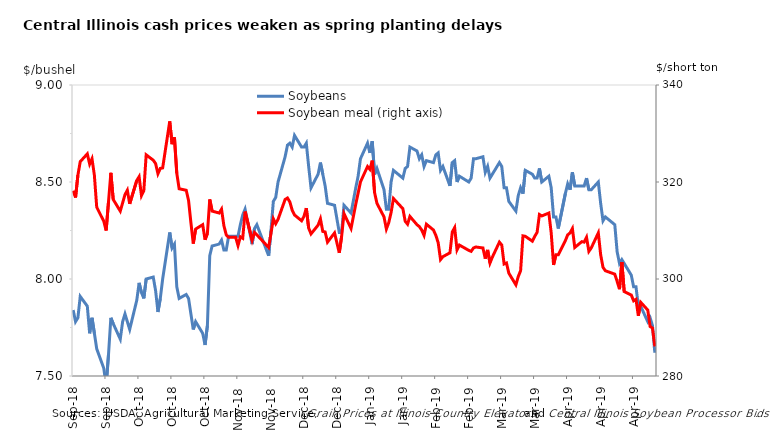
| Category | Soybeans |
|---|---|
| 2018-09-04 | 7.84 |
| 2018-09-05 | 7.78 |
| 2018-09-06 | 7.8 |
| 2018-09-07 | 7.91 |
| 2018-09-10 | 7.86 |
| 2018-09-11 | 7.72 |
| 2018-09-12 | 7.8 |
| 2018-09-13 | 7.72 |
| 2018-09-14 | 7.64 |
| 2018-09-17 | 7.54 |
| 2018-09-18 | 7.45 |
| 2018-09-19 | 7.61 |
| 2018-09-20 | 7.8 |
| 2018-09-21 | 7.77 |
| 2018-09-24 | 7.69 |
| 2018-09-25 | 7.78 |
| 2018-09-26 | 7.82 |
| 2018-09-27 | 7.78 |
| 2018-09-28 | 7.74 |
| 2018-10-01 | 7.89 |
| 2018-10-02 | 7.98 |
| 2018-10-03 | 7.93 |
| 2018-10-04 | 7.9 |
| 2018-10-05 | 8 |
| 2018-10-08 | 8.01 |
| 2018-10-09 | 7.94 |
| 2018-10-10 | 7.83 |
| 2018-10-11 | 7.9 |
| 2018-10-12 | 8 |
| 2018-10-15 | 8.24 |
| 2018-10-16 | 8.16 |
| 2018-10-17 | 8.18 |
| 2018-10-18 | 7.96 |
| 2018-10-19 | 7.9 |
| 2018-10-22 | 7.92 |
| 2018-10-23 | 7.9 |
| 2018-10-24 | 7.82 |
| 2018-10-25 | 7.74 |
| 2018-10-26 | 7.78 |
| 2018-10-29 | 7.72 |
| 2018-10-30 | 7.66 |
| 2018-10-31 | 7.76 |
| 2018-11-01 | 8.12 |
| 2018-11-02 | 8.17 |
| 2018-11-05 | 8.18 |
| 2018-11-06 | 8.2 |
| 2018-11-07 | 8.15 |
| 2018-11-08 | 8.15 |
| 2018-11-09 | 8.22 |
| 2018-11-12 | 8.22 |
| 2018-11-13 | 8.22 |
| 2018-11-14 | 8.28 |
| 2018-11-15 | 8.33 |
| 2018-11-16 | 8.36 |
| 2018-11-19 | 8.18 |
| 2018-11-20 | 8.26 |
| 2018-11-21 | 8.28 |
| 2018-11-26 | 8.12 |
| 2018-11-27 | 8.25 |
| 2018-11-28 | 8.4 |
| 2018-11-29 | 8.42 |
| 2018-11-30 | 8.5 |
| 2018-12-03 | 8.63 |
| 2018-12-04 | 8.69 |
| 2018-12-05 | 8.7 |
| 2018-12-06 | 8.68 |
| 2018-12-07 | 8.74 |
| 2018-12-10 | 8.68 |
| 2018-12-11 | 8.68 |
| 2018-12-12 | 8.7 |
| 2018-12-13 | 8.58 |
| 2018-12-14 | 8.47 |
| 2018-12-17 | 8.54 |
| 2018-12-18 | 8.6 |
| 2018-12-19 | 8.54 |
| 2018-12-20 | 8.48 |
| 2018-12-21 | 8.39 |
| 2018-12-24 | 8.38 |
| 2018-12-26 | 8.24 |
| 2018-12-27 | 8.24 |
| 2018-12-28 | 8.38 |
| 2018-12-31 | 8.34 |
| 2019-01-02 | 8.47 |
| 2019-01-03 | 8.53 |
| 2019-01-04 | 8.62 |
| 2019-01-07 | 8.7 |
| 2019-01-08 | 8.65 |
| 2019-01-09 | 8.71 |
| 2019-01-10 | 8.54 |
| 2019-01-11 | 8.57 |
| 2019-01-14 | 8.46 |
| 2019-01-15 | 8.36 |
| 2019-01-16 | 8.36 |
| 2019-01-17 | 8.5 |
| 2019-01-18 | 8.56 |
| 2019-01-22 | 8.52 |
| 2019-01-23 | 8.57 |
| 2019-01-24 | 8.58 |
| 2019-01-25 | 8.68 |
| 2019-01-28 | 8.66 |
| 2019-01-29 | 8.62 |
| 2019-01-30 | 8.64 |
| 2019-01-31 | 8.58 |
| 2019-02-01 | 8.61 |
| 2019-02-04 | 8.6 |
| 2019-02-05 | 8.64 |
| 2019-02-06 | 8.65 |
| 2019-02-07 | 8.56 |
| 2019-02-08 | 8.58 |
| 2019-02-11 | 8.48 |
| 2019-02-12 | 8.6 |
| 2019-02-13 | 8.61 |
| 2019-02-14 | 8.5 |
| 2019-02-15 | 8.53 |
| 2019-02-19 | 8.5 |
| 2019-02-20 | 8.52 |
| 2019-02-21 | 8.62 |
| 2019-02-22 | 8.62 |
| 2019-02-25 | 8.63 |
| 2019-02-26 | 8.55 |
| 2019-02-27 | 8.58 |
| 2019-02-28 | 8.52 |
| 2019-03-01 | 8.54 |
| 2019-03-04 | 8.6 |
| 2019-03-05 | 8.58 |
| 2019-03-06 | 8.47 |
| 2019-03-07 | 8.47 |
| 2019-03-08 | 8.4 |
| 2019-03-11 | 8.35 |
| 2019-03-12 | 8.43 |
| 2019-03-13 | 8.47 |
| 2019-03-14 | 8.44 |
| 2019-03-15 | 8.56 |
| 2019-03-18 | 8.54 |
| 2019-03-19 | 8.52 |
| 2019-03-20 | 8.52 |
| 2019-03-21 | 8.57 |
| 2019-03-22 | 8.5 |
| 2019-03-25 | 8.53 |
| 2019-03-26 | 8.47 |
| 2019-03-27 | 8.32 |
| 2019-03-28 | 8.32 |
| 2019-03-29 | 8.26 |
| 2019-04-01 | 8.44 |
| 2019-04-02 | 8.49 |
| 2019-04-03 | 8.46 |
| 2019-04-04 | 8.55 |
| 2019-04-05 | 8.48 |
| 2019-04-08 | 8.48 |
| 2019-04-09 | 8.48 |
| 2019-04-10 | 8.52 |
| 2019-04-11 | 8.46 |
| 2019-04-12 | 8.46 |
| 2019-04-15 | 8.5 |
| 2019-04-16 | 8.39 |
| 2019-04-17 | 8.3 |
| 2019-04-18 | 8.32 |
| 2019-04-22 | 8.28 |
| 2019-04-23 | 8.14 |
| 2019-04-24 | 8.08 |
| 2019-04-25 | 8.1 |
| 2019-04-26 | 8.08 |
| 2019-04-29 | 8.02 |
| 2019-04-30 | 7.96 |
| 2019-05-01 | 7.96 |
| 2019-05-02 | 7.86 |
| 2019-05-03 | 7.86 |
| 2019-05-06 | 7.78 |
| 2019-05-07 | 7.8 |
| 2019-05-08 | 7.76 |
| 2019-05-09 | 7.62 |